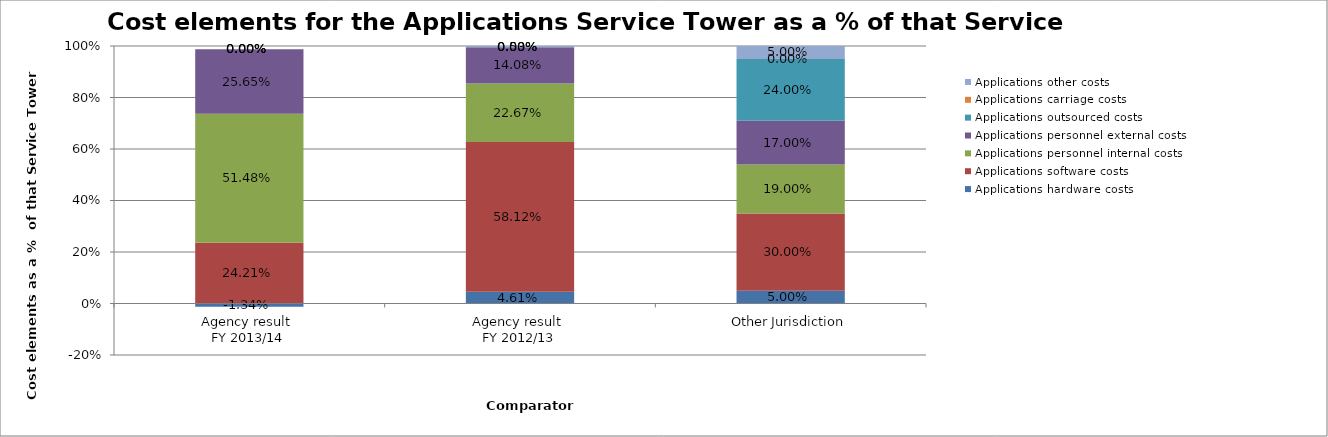
| Category | Applications hardware costs | Applications software costs | Applications personnel internal costs | Applications personnel external costs | Applications outsourced costs | Applications carriage costs | Applications other costs |
|---|---|---|---|---|---|---|---|
| Agency result 
FY 2013/14 | -0.013 | 0.242 | 0.515 | 0.256 | 0 | 0 | 0 |
| Agency result 
FY 2012/13 | 0.046 | 0.581 | 0.227 | 0.141 | 0 | 0 | 0.005 |
| Other Jurisdiction | 0.05 | 0.3 | 0.19 | 0.17 | 0.24 | 0 | 0.05 |